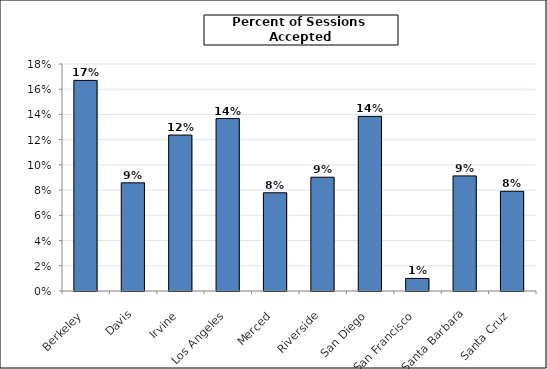
| Category | Sessions Accepted (by responding library) |
|---|---|
| Berkeley | 0.167 |
| Davis | 0.086 |
| Irvine | 0.124 |
| Los Angeles | 0.137 |
| Merced | 0.078 |
| Riverside | 0.09 |
| San Diego | 0.138 |
| San Francisco | 0.01 |
| Santa Barbara | 0.091 |
| Santa Cruz | 0.079 |